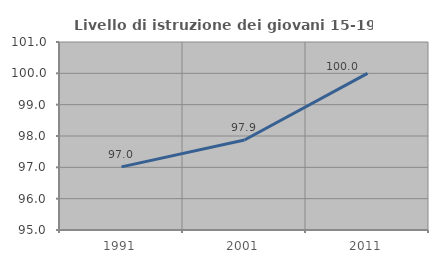
| Category | Livello di istruzione dei giovani 15-19 anni |
|---|---|
| 1991.0 | 97.015 |
| 2001.0 | 97.872 |
| 2011.0 | 100 |